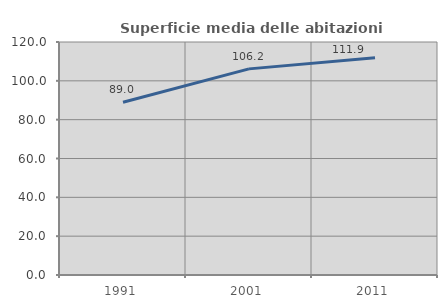
| Category | Superficie media delle abitazioni occupate |
|---|---|
| 1991.0 | 88.992 |
| 2001.0 | 106.162 |
| 2011.0 | 111.872 |